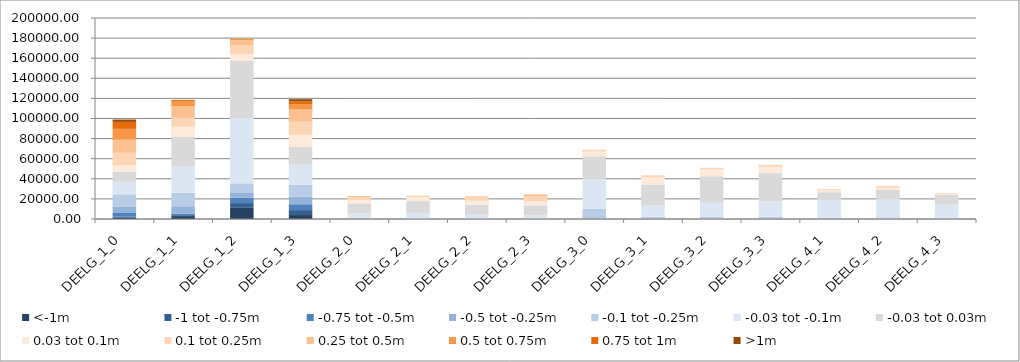
| Category | <-1m | -1 tot -0.75m | -0.75 tot -0.5m | -0.5 tot -0.25m | -0.1 tot -0.25m | -0.03 tot -0.1m | -0.03 tot 0.03m | 0.03 tot 0.1m | 0.1 tot 0.25m | 0.25 tot 0.5m | 0.5 tot 0.75m | 0.75 tot 1m | >1m |
|---|---|---|---|---|---|---|---|---|---|---|---|---|---|
| DEELG_1_0 | 1173 | 1182 | 3625 | 6555 | 12061 | 12505 | 10184 | 6409 | 12255 | 12909 | 10819 | 6982 | 2312 |
| DEELG_1_1 | 2901 | 908 | 1609 | 7280 | 13498 | 25861 | 29701 | 10044 | 8799 | 11752 | 5100 | 878 | 187 |
| DEELG_1_2 | 11626 | 4212 | 5411 | 4623 | 9590 | 65106 | 56899 | 6746 | 8436 | 5379 | 1114 | 129 | 17 |
| DEELG_1_3 | 3931 | 4948 | 5803 | 7604 | 11844 | 19869 | 17864 | 11926 | 12959 | 12214 | 5438 | 2669 | 2122 |
| DEELG_2_0 | 1 | 3 | 35 | 356 | 810 | 4373 | 10018 | 3169 | 2893 | 947 | 137 | 19 | 1 |
| DEELG_2_1 | 0 | 0 | 2 | 28 | 332 | 5730 | 11647 | 4044 | 1429 | 111 | 18 | 0 | 0 |
| DEELG_2_2 | 0 | 0 | 0 | 39 | 317 | 4098 | 9874 | 3927 | 3239 | 943 | 37 | 0 | 0 |
| DEELG_2_3 | 0 | 0 | 3 | 39 | 312 | 3330 | 9896 | 4167 | 4491 | 2170 | 142 | 1 | 0 |
| DEELG_3_0 | 2 | 7 | 35 | 658 | 9289 | 29952 | 22520 | 4764 | 1470 | 178 | 13 | 9 | 1 |
| DEELG_3_1 | 0 | 0 | 4 | 148 | 2173 | 10970 | 21073 | 7000 | 1924 | 131 | 2 | 0 | 0 |
| DEELG_3_2 | 4 | 3 | 12 | 135 | 1888 | 14137 | 26310 | 6933 | 1434 | 82 | 4 | 2 | 0 |
| DEELG_3_3 | 0 | 1 | 15 | 144 | 2237 | 15005 | 28292 | 6223 | 1837 | 151 | 14 | 1 | 0 |
| DEELG_4_1 | 0 | 0 | 3 | 78 | 1376 | 17997 | 7128 | 1968 | 1089 | 161 | 10 | 3 | 1 |
| DEELG_4_2 | 0 | 0 | 9 | 166 | 1498 | 18044 | 9169 | 2413 | 1352 | 247 | 16 | 2 | 2 |
| DEELG_4_3 | 0 | 1 | 4 | 133 | 623 | 13588 | 9516 | 1346 | 469 | 77 | 10 | 3 | 4 |